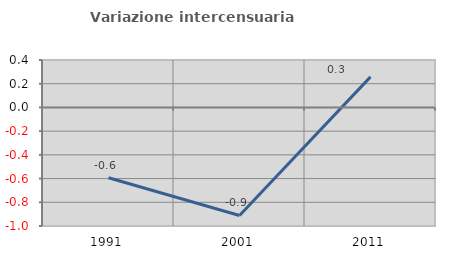
| Category | Variazione intercensuaria annua |
|---|---|
| 1991.0 | -0.593 |
| 2001.0 | -0.911 |
| 2011.0 | 0.258 |